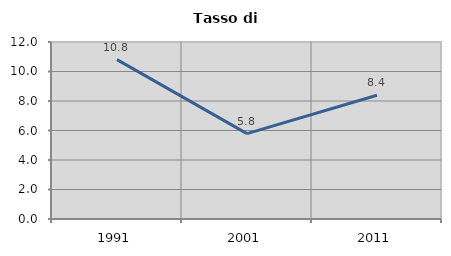
| Category | Tasso di disoccupazione   |
|---|---|
| 1991.0 | 10.803 |
| 2001.0 | 5.792 |
| 2011.0 | 8.387 |